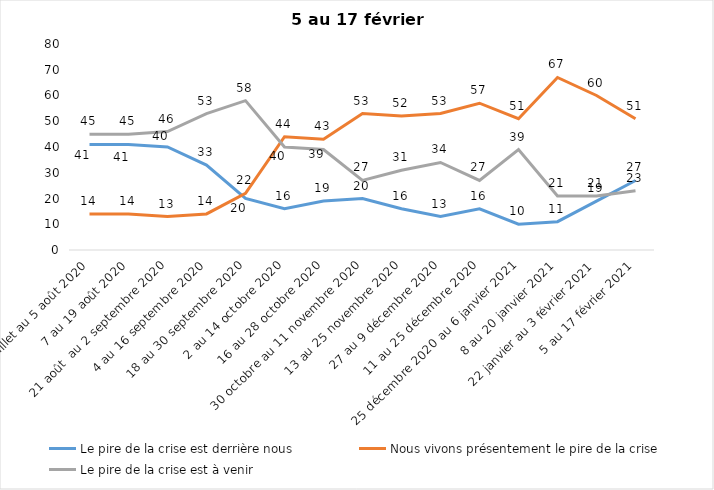
| Category | Le pire de la crise est derrière nous | Nous vivons présentement le pire de la crise | Le pire de la crise est à venir |
|---|---|---|---|
| 24 juillet au 5 août 2020 | 41 | 14 | 45 |
| 7 au 19 août 2020 | 41 | 14 | 45 |
| 21 août  au 2 septembre 2020 | 40 | 13 | 46 |
| 4 au 16 septembre 2020 | 33 | 14 | 53 |
| 18 au 30 septembre 2020 | 20 | 22 | 58 |
| 2 au 14 octobre 2020 | 16 | 44 | 40 |
| 16 au 28 octobre 2020 | 19 | 43 | 39 |
| 30 octobre au 11 novembre 2020 | 20 | 53 | 27 |
| 13 au 25 novembre 2020 | 16 | 52 | 31 |
| 27 au 9 décembre 2020 | 13 | 53 | 34 |
| 11 au 25 décembre 2020 | 16 | 57 | 27 |
| 25 décembre 2020 au 6 janvier 2021 | 10 | 51 | 39 |
| 8 au 20 janvier 2021 | 11 | 67 | 21 |
| 22 janvier au 3 février 2021 | 19 | 60 | 21 |
| 5 au 17 février 2021 | 27 | 51 | 23 |